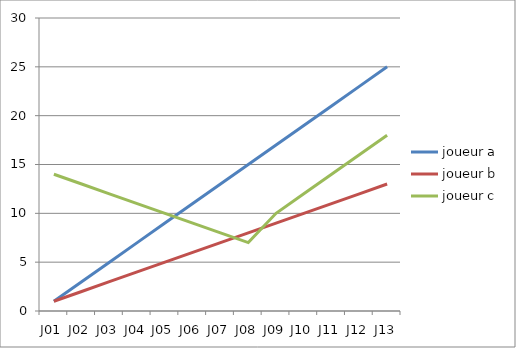
| Category | joueur a | joueur b | joueur c |
|---|---|---|---|
| J01 | 1 | 1 | 14 |
| J02 | 3 | 2 | 13 |
| J03 | 5 | 3 | 12 |
| J04 | 7 | 4 | 11 |
| J05 | 9 | 5 | 10 |
| J06 | 11 | 6 | 9 |
| J07 | 13 | 7 | 8 |
| J08 | 15 | 8 | 7 |
| J09 | 17 | 9 | 10 |
| J10 | 19 | 10 | 12 |
| J11 | 21 | 11 | 14 |
| J12 | 23 | 12 | 16 |
| J13 | 25 | 13 | 18 |